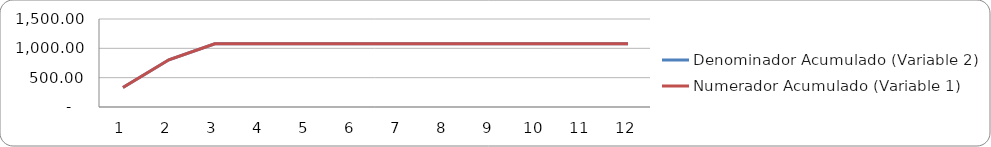
| Category | Denominador Acumulado (Variable 2) | Numerador Acumulado (Variable 1) |
|---|---|---|
| 0 | 331 | 331 |
| 1 | 805 | 805 |
| 2 | 1077 | 1077 |
| 3 | 1077 | 1077 |
| 4 | 1077 | 1077 |
| 5 | 1077 | 1077 |
| 6 | 1077 | 1077 |
| 7 | 1077 | 1077 |
| 8 | 1077 | 1077 |
| 9 | 1077 | 1077 |
| 10 | 1077 | 1077 |
| 11 | 1077 | 1077 |